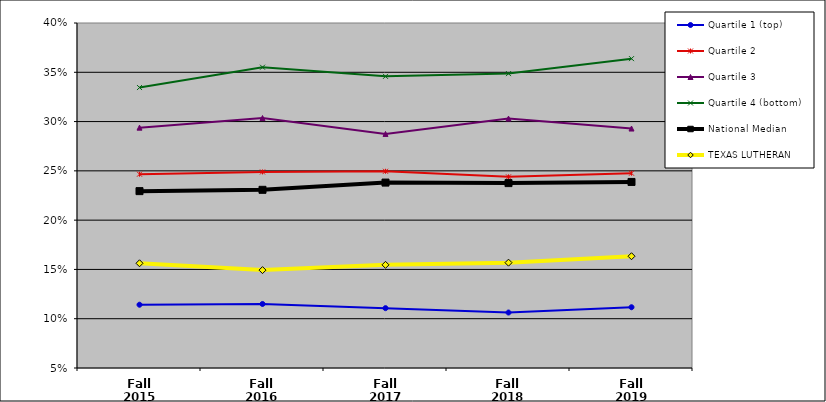
| Category | Quartile 1 (top) | Quartile 2 | Quartile 3 | Quartile 4 (bottom) | National Median | TEXAS LUTHERAN |
|---|---|---|---|---|---|---|
| Fall 2015 | 0.114 | 0.247 | 0.294 | 0.335 | 0.229 | 0.156 |
| Fall 2016 | 0.115 | 0.249 | 0.304 | 0.355 | 0.231 | 0.149 |
| Fall 2017 | 0.111 | 0.25 | 0.287 | 0.346 | 0.238 | 0.155 |
| Fall 2018 | 0.106 | 0.244 | 0.303 | 0.349 | 0.238 | 0.157 |
| Fall 2019 | 0.112 | 0.248 | 0.293 | 0.364 | 0.239 | 0.163 |